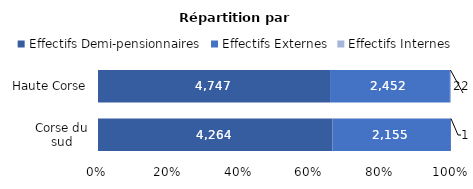
| Category | Effectifs Demi-pensionnaires | Effectifs Externes | Effectifs Internes |
|---|---|---|---|
| Corse du sud | 4264 | 2155 | 1 |
| Haute Corse | 4747 | 2452 | 22 |